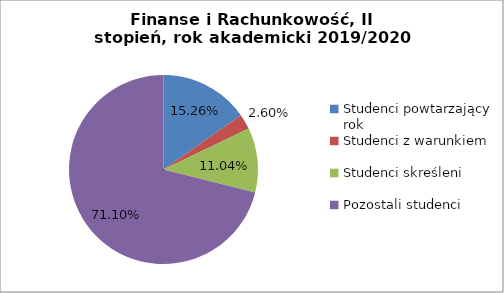
| Category | Series 0 |
|---|---|
| Studenci powtarzający rok | 47 |
| Studenci z warunkiem | 8 |
| Studenci skreśleni | 34 |
| Pozostali studenci | 219 |